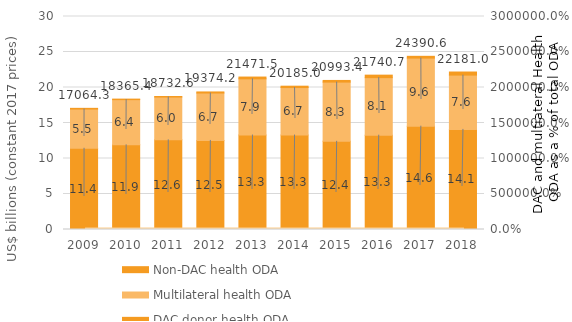
| Category | DAC donor health ODA | Multilateral health ODA | Non-DAC health ODA |
|---|---|---|---|
| 2009.0 | 11439.651 | 5524.091 | 100.518 |
| 2010.0 | 11924.014 | 6364.551 | 76.808 |
| 2011.0 | 12623.907 | 6029.913 | 78.735 |
| 2012.0 | 12543.881 | 6677.971 | 152.384 |
| 2013.0 | 13304.607 | 7915.115 | 251.764 |
| 2014.0 | 13305.044 | 6688.859 | 191.128 |
| 2015.0 | 12416.565 | 8343.804 | 233.058 |
| 2016.0 | 13281.741 | 8106.276 | 352.703 |
| 2017.0 | 14551.105 | 9592.136 | 247.317 |
| 2018.0 | 14096.631 | 7648.334 | 436.063 |